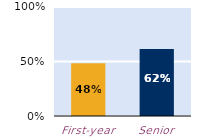
| Category | frequently |
|---|---|
| First-year | 0.484 |
| Senior | 0.615 |